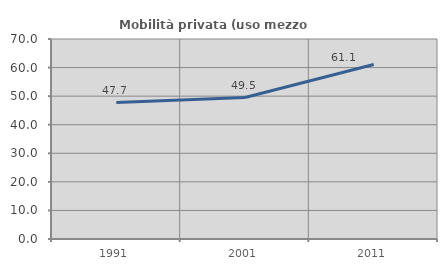
| Category | Mobilità privata (uso mezzo privato) |
|---|---|
| 1991.0 | 47.733 |
| 2001.0 | 49.502 |
| 2011.0 | 61.086 |